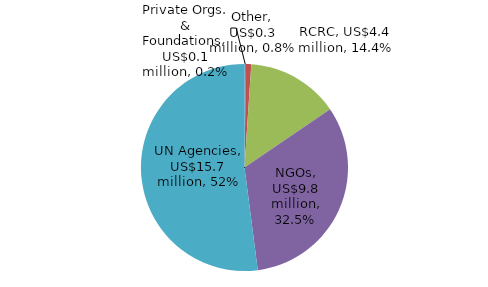
| Category | Series 0 |
|---|---|
| Private Orgs. & Foundations | 0.066 |
| Other | 0.25 |
| RCRC | 4.352 |
| NGOs | 9.792 |
| UN Agencies | 15.696 |